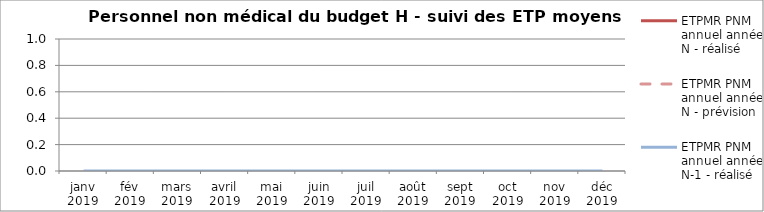
| Category | ETPMR PNM annuel année N - réalisé | ETPMR PNM annuel année N - prévision | ETPMR PNM annuel année N-1 - réalisé |
|---|---|---|---|
| janv 2019 |  |  | 0 |
| fév 2019 |  |  | 0 |
| mars 2019 |  |  | 0 |
| avril 2019 |  |  | 0 |
| mai 2019 |  |  | 0 |
| juin 2019 |  |  | 0 |
| juil 2019 |  |  | 0 |
| août 2019 |  |  | 0 |
| sept 2019 |  |  | 0 |
| oct 2019 |  |  | 0 |
| nov 2019 |  |  | 0 |
| déc 2019 |  |  | 0 |